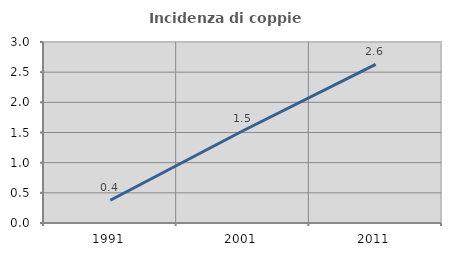
| Category | Incidenza di coppie miste |
|---|---|
| 1991.0 | 0.378 |
| 2001.0 | 1.529 |
| 2011.0 | 2.629 |